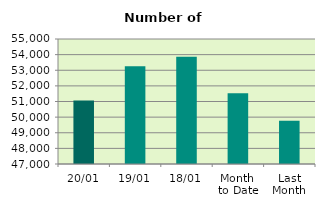
| Category | Series 0 |
|---|---|
| 20/01 | 51066 |
| 19/01 | 53252 |
| 18/01 | 53866 |
| Month 
to Date | 51533.714 |
| Last
Month | 49764 |